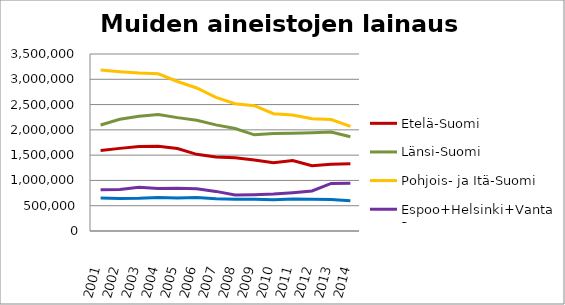
| Category | Etelä-Suomi | Länsi-Suomi | Pohjois- ja Itä-Suomi | Espoo+Helsinki+Vantaa | Muu Uusimaa |
|---|---|---|---|---|---|
| 2001.0 | 1590808 | 2095483 | 3182286 | 815108 | 651552 |
| 2002.0 | 1633998 | 2209339 | 3151246 | 819626 | 644007 |
| 2003.0 | 1672011 | 2267157 | 3123615 | 863670 | 648591 |
| 2004.0 | 1676949 | 2302797 | 3108414 | 839097 | 661788 |
| 2005.0 | 1629707 | 2242123 | 2956757 | 846231 | 654960 |
| 2006.0 | 1515911 | 2190072 | 2827407 | 836564 | 660305 |
| 2007.0 | 1463712 | 2098053 | 2641908 | 783042 | 636332 |
| 2008.0 | 1446928 | 2025765 | 2515608 | 712132 | 625991 |
| 2009.0 | 1402926 | 1902108 | 2478894 | 717906 | 628472 |
| 2010.0 | 1348199 | 1928066 | 2318644 | 730441 | 615690 |
| 2011.0 | 1393857 | 1934362 | 2292461 | 757303 | 631741 |
| 2012.0 | 1289613 | 1945102 | 2218368 | 790817 | 627498 |
| 2013.0 | 1318470 | 1956919 | 2203479 | 941365 | 623308 |
| 2014.0 | 1327867 | 1865118 | 2067680 | 943493 | 597153 |